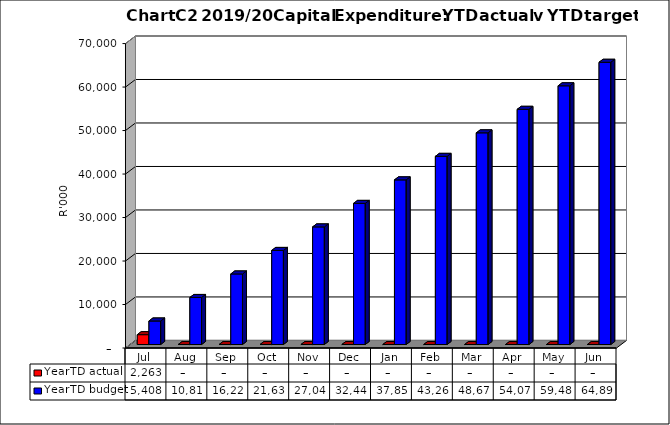
| Category | YearTD actual | YearTD budget |
|---|---|---|
| Jul | 2263488 | 5407906 |
| Aug | 0 | 10815812 |
| Sep | 0 | 16223718 |
| Oct | 0 | 21631624 |
| Nov | 0 | 27039530 |
| Dec | 0 | 32447436 |
| Jan | 0 | 37855342 |
| Feb | 0 | 43263248 |
| Mar | 0 | 48671154 |
| Apr | 0 | 54079060 |
| May | 0 | 59486966 |
| Jun | 0 | 64894876 |